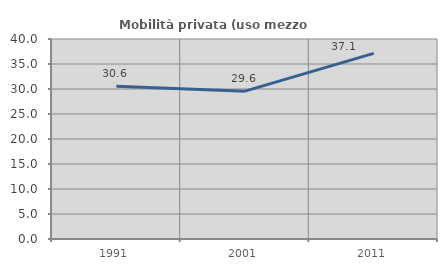
| Category | Mobilità privata (uso mezzo privato) |
|---|---|
| 1991.0 | 30.569 |
| 2001.0 | 29.563 |
| 2011.0 | 37.134 |